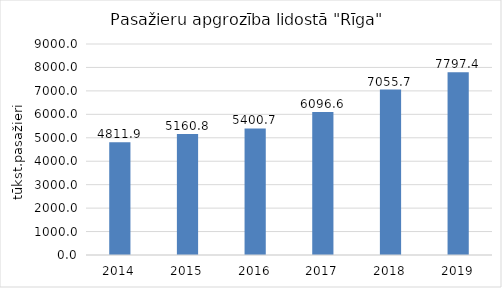
| Category | Series 0 |
|---|---|
| 2014.0 | 4811.949 |
| 2015.0 | 5160.759 |
| 2016.0 | 5400.709 |
| 2017.0 | 6096.62 |
| 2018.0 | 7055.734 |
| 2019.0 | 7797.4 |